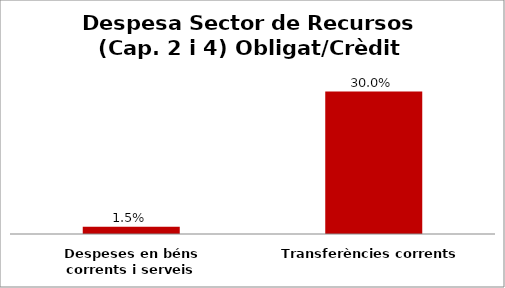
| Category | Series 0 |
|---|---|
| Despeses en béns corrents i serveis | 0.015 |
| Transferències corrents | 0.3 |